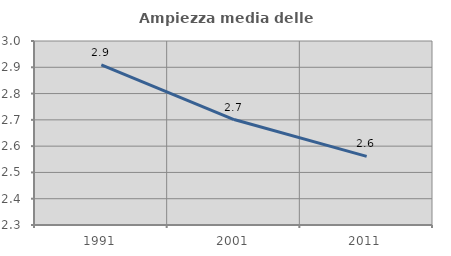
| Category | Ampiezza media delle famiglie |
|---|---|
| 1991.0 | 2.909 |
| 2001.0 | 2.701 |
| 2011.0 | 2.561 |